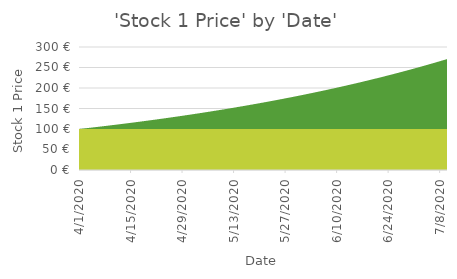
| Category | Stock 1 Price | Stock 2 | Stock 3 |
|---|---|---|---|
| 4/1/20 | 100 | 100 | 100 |
| 4/2/20 | 101 | 100 | 100 |
| 4/3/20 | 102.01 | 100 | 100 |
| 4/4/20 | 103.03 | 100 | 100 |
| 4/5/20 | 104.06 | 100 | 100 |
| 4/6/20 | 105.101 | 100 | 100 |
| 4/7/20 | 106.152 | 100 | 100 |
| 4/8/20 | 107.214 | 100 | 100 |
| 4/9/20 | 108.286 | 100 | 100 |
| 4/10/20 | 109.369 | 100 | 100 |
| 4/11/20 | 110.462 | 100 | 100 |
| 4/12/20 | 111.567 | 100 | 100 |
| 4/13/20 | 112.683 | 100 | 100 |
| 4/14/20 | 113.809 | 100 | 100 |
| 4/15/20 | 114.947 | 100 | 100 |
| 4/16/20 | 116.097 | 100 | 100 |
| 4/17/20 | 117.258 | 100 | 100 |
| 4/18/20 | 118.43 | 100 | 100 |
| 4/19/20 | 119.615 | 100 | 100 |
| 4/20/20 | 120.811 | 100 | 100 |
| 4/21/20 | 122.019 | 100 | 100 |
| 4/22/20 | 123.239 | 100 | 100 |
| 4/23/20 | 124.472 | 100 | 100 |
| 4/24/20 | 125.716 | 100 | 100 |
| 4/25/20 | 126.973 | 100 | 100 |
| 4/26/20 | 128.243 | 100 | 100 |
| 4/27/20 | 129.526 | 100 | 100 |
| 4/28/20 | 130.821 | 100 | 100 |
| 4/29/20 | 132.129 | 100 | 100 |
| 4/30/20 | 133.45 | 100 | 100 |
| 5/1/20 | 134.785 | 100 | 100 |
| 5/2/20 | 136.133 | 100 | 100 |
| 5/3/20 | 137.494 | 100 | 100 |
| 5/4/20 | 138.869 | 100 | 100 |
| 5/5/20 | 140.258 | 100 | 100 |
| 5/6/20 | 141.66 | 100 | 100 |
| 5/7/20 | 143.077 | 100 | 100 |
| 5/8/20 | 144.508 | 100 | 100 |
| 5/9/20 | 145.953 | 100 | 100 |
| 5/10/20 | 147.412 | 100 | 100 |
| 5/11/20 | 148.886 | 100 | 100 |
| 5/12/20 | 150.375 | 100 | 100 |
| 5/13/20 | 151.879 | 100 | 100 |
| 5/14/20 | 153.398 | 100 | 100 |
| 5/15/20 | 154.932 | 100 | 100 |
| 5/16/20 | 156.481 | 100 | 100 |
| 5/17/20 | 158.046 | 100 | 100 |
| 5/18/20 | 159.626 | 100 | 100 |
| 5/19/20 | 161.223 | 100 | 100 |
| 5/20/20 | 162.835 | 100 | 100 |
| 5/21/20 | 164.463 | 100 | 100 |
| 5/22/20 | 166.108 | 100 | 100 |
| 5/23/20 | 167.769 | 100 | 100 |
| 5/24/20 | 169.447 | 100 | 100 |
| 5/25/20 | 171.141 | 100 | 100 |
| 5/26/20 | 172.852 | 100 | 100 |
| 5/27/20 | 174.581 | 100 | 100 |
| 5/28/20 | 176.327 | 100 | 100 |
| 5/29/20 | 178.09 | 100 | 100 |
| 5/30/20 | 179.871 | 100 | 100 |
| 5/31/20 | 181.67 | 100 | 100 |
| 6/1/20 | 183.486 | 100 | 100 |
| 6/2/20 | 185.321 | 100 | 100 |
| 6/3/20 | 187.174 | 100 | 100 |
| 6/4/20 | 189.046 | 100 | 100 |
| 6/5/20 | 190.937 | 100 | 100 |
| 6/6/20 | 192.846 | 100 | 100 |
| 6/7/20 | 194.774 | 100 | 100 |
| 6/8/20 | 196.722 | 100 | 100 |
| 6/9/20 | 198.689 | 100 | 100 |
| 6/10/20 | 200.676 | 100 | 100 |
| 6/11/20 | 202.683 | 100 | 100 |
| 6/12/20 | 204.71 | 100 | 100 |
| 6/13/20 | 206.757 | 100 | 100 |
| 6/14/20 | 208.825 | 100 | 100 |
| 6/15/20 | 210.913 | 100 | 100 |
| 6/16/20 | 213.022 | 100 | 100 |
| 6/17/20 | 215.152 | 100 | 100 |
| 6/18/20 | 217.304 | 100 | 100 |
| 6/19/20 | 219.477 | 100 | 100 |
| 6/20/20 | 221.672 | 100 | 100 |
| 6/21/20 | 223.888 | 100 | 100 |
| 6/22/20 | 226.127 | 100 | 100 |
| 6/23/20 | 228.388 | 100 | 100 |
| 6/24/20 | 230.672 | 100 | 100 |
| 6/25/20 | 232.979 | 100 | 100 |
| 6/26/20 | 235.309 | 100 | 100 |
| 6/27/20 | 237.662 | 100 | 100 |
| 6/28/20 | 240.038 | 100 | 100 |
| 6/29/20 | 242.439 | 100 | 100 |
| 6/30/20 | 244.863 | 100 | 100 |
| 7/1/20 | 247.312 | 100 | 100 |
| 7/2/20 | 249.785 | 100 | 100 |
| 7/3/20 | 252.283 | 100 | 100 |
| 7/4/20 | 254.806 | 100 | 100 |
| 7/5/20 | 257.354 | 100 | 100 |
| 7/6/20 | 259.927 | 100 | 100 |
| 7/7/20 | 262.527 | 100 | 100 |
| 7/8/20 | 265.152 | 100 | 100 |
| 7/9/20 | 267.803 | 100 | 100 |
| 7/10/20 | 270.481 | 100 | 100 |